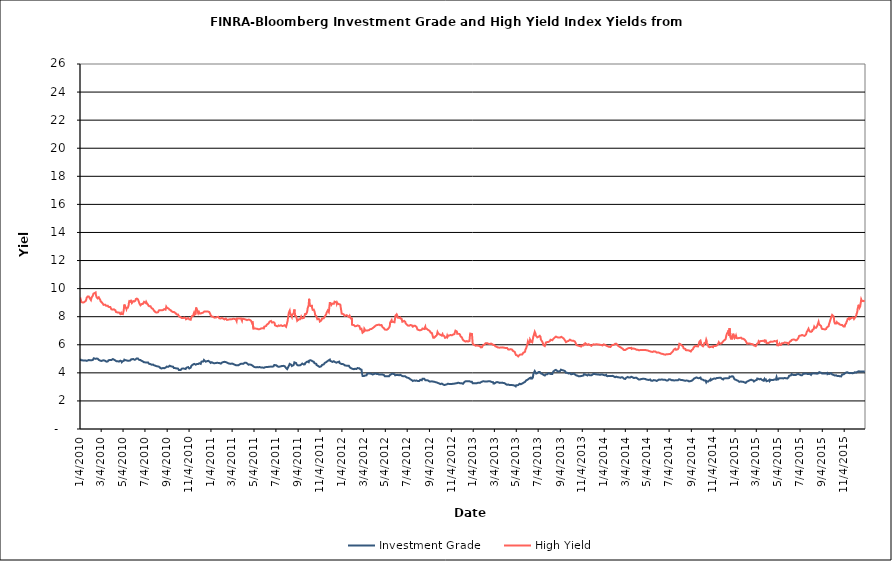
| Category | Investment Grade | High Yield |
|---|---|---|
| 1/4/10 | 4.999 | 9.369 |
| 1/5/10 | 4.915 | 9.304 |
| 1/6/10 | 4.922 | 9.169 |
| 1/7/10 | 4.901 | 9.047 |
| 1/8/10 | 4.898 | 9.058 |
| 1/11/10 | 4.889 | 9.014 |
| 1/12/10 | 4.849 | 8.983 |
| 1/13/10 | 4.867 | 8.998 |
| 1/14/10 | 4.871 | 9.02 |
| 1/15/10 | 4.832 | 9.091 |
| 1/19/10 | 4.881 | 9.112 |
| 1/20/10 | 4.852 | 9.144 |
| 1/21/10 | 4.825 | 9.212 |
| 1/22/10 | 4.854 | 9.354 |
| 1/25/10 | 4.879 | 9.444 |
| 1/26/10 | 4.876 | 9.444 |
| 1/27/10 | 4.892 | 9.447 |
| 1/28/10 | 4.912 | 9.438 |
| 1/29/10 | 4.911 | 9.441 |
| 2/1/10 | 4.898 | 9.258 |
| 2/2/10 | 4.887 | 9.234 |
| 2/3/10 | 4.905 | 9.182 |
| 2/4/10 | 4.894 | 9.243 |
| 2/5/10 | 4.893 | 9.376 |
| 2/8/10 | 4.912 | 9.483 |
| 2/9/10 | 4.939 | 9.516 |
| 2/10/10 | 4.971 | 9.639 |
| 2/11/10 | 5.039 | 9.675 |
| 2/12/10 | 4.988 | 9.653 |
| 2/16/10 | 4.997 | 9.725 |
| 2/17/10 | 4.998 | 9.538 |
| 2/18/10 | 5.011 | 9.459 |
| 2/19/10 | 5.022 | 9.382 |
| 2/22/10 | 5 | 9.304 |
| 2/23/10 | 4.958 | 9.367 |
| 2/24/10 | 4.935 | 9.339 |
| 2/25/10 | 4.92 | 9.38 |
| 2/26/10 | 4.868 | 9.358 |
| 3/1/10 | 4.871 | 9.182 |
| 3/2/10 | 4.868 | 9.1 |
| 3/3/10 | 4.852 | 9.072 |
| 3/4/10 | 4.843 | 9.086 |
| 3/5/10 | 4.878 | 9.023 |
| 3/8/10 | 4.885 | 8.941 |
| 3/9/10 | 4.872 | 8.914 |
| 3/10/10 | 4.891 | 8.842 |
| 3/11/10 | 4.893 | 8.854 |
| 3/12/10 | 4.861 | 8.844 |
| 3/15/10 | 4.852 | 8.855 |
| 3/16/10 | 4.828 | 8.822 |
| 3/17/10 | 4.8 | 8.781 |
| 3/18/10 | 4.799 | 8.748 |
| 3/19/10 | 4.808 | 8.733 |
| 3/22/10 | 4.815 | 8.778 |
| 3/23/10 | 4.809 | 8.757 |
| 3/24/10 | 4.894 | 8.699 |
| 3/25/10 | 4.937 | 8.722 |
| 3/26/10 | 4.928 | 8.701 |
| 3/29/10 | 4.919 | 8.691 |
| 3/30/10 | 4.908 | 8.658 |
| 3/31/10 | 4.877 | 8.678 |
| 4/1/10 | 4.914 | 8.523 |
| 4/5/10 | 4.983 | 8.504 |
| 4/6/10 | 4.988 | 8.531 |
| 4/7/10 | 4.95 | 8.513 |
| 4/8/10 | 4.942 | 8.525 |
| 4/9/10 | 4.93 | 8.482 |
| 4/12/10 | 4.884 | 8.459 |
| 4/13/10 | 4.857 | 8.414 |
| 4/14/10 | 4.843 | 8.332 |
| 4/15/10 | 4.829 | 8.282 |
| 4/16/10 | 4.795 | 8.274 |
| 4/19/10 | 4.827 | 8.295 |
| 4/20/10 | 4.828 | 8.274 |
| 4/21/10 | 4.8 | 8.241 |
| 4/22/10 | 4.802 | 8.303 |
| 4/23/10 | 4.852 | 8.252 |
| 4/26/10 | 4.868 | 8.194 |
| 4/27/10 | 4.82 | 8.211 |
| 4/28/10 | 4.838 | 8.267 |
| 4/29/10 | 4.826 | 8.192 |
| 4/30/10 | 4.754 | 8.225 |
| 5/3/10 | 4.831 | 8.182 |
| 5/4/10 | 4.808 | 8.233 |
| 5/5/10 | 4.814 | 8.404 |
| 5/6/10 | 4.863 | 8.601 |
| 5/7/10 | 4.939 | 8.865 |
| 5/10/10 | 4.906 | 8.687 |
| 5/11/10 | 4.915 | 8.722 |
| 5/12/10 | 4.924 | 8.609 |
| 5/13/10 | 4.885 | 8.536 |
| 5/14/10 | 4.846 | 8.618 |
| 5/17/10 | 4.86 | 8.642 |
| 5/18/10 | 4.84 | 8.689 |
| 5/19/10 | 4.848 | 8.817 |
| 5/20/10 | 4.862 | 9.024 |
| 5/21/10 | 4.898 | 9.108 |
| 5/24/10 | 4.886 | 9.066 |
| 5/25/10 | 4.956 | 9.198 |
| 5/26/10 | 4.962 | 9.128 |
| 5/27/10 | 5.008 | 9.046 |
| 5/28/10 | 4.962 | 8.975 |
| 6/1/10 | 4.985 | 9.11 |
| 6/2/10 | 5.007 | 9.12 |
| 6/3/10 | 4.998 | 9.067 |
| 6/4/10 | 4.934 | 9.086 |
| 6/7/10 | 4.943 | 9.145 |
| 6/8/10 | 4.961 | 9.251 |
| 6/9/10 | 4.962 | 9.245 |
| 6/10/10 | 5.018 | 9.225 |
| 6/11/10 | 5.016 | 9.29 |
| 6/14/10 | 5.015 | 9.235 |
| 6/15/10 | 5.01 | 9.184 |
| 6/16/10 | 4.997 | 9.102 |
| 6/17/10 | 4.929 | 9.019 |
| 6/18/10 | 4.921 | 8.943 |
| 6/21/10 | 4.912 | 8.814 |
| 6/22/10 | 4.884 | 8.838 |
| 6/23/10 | 4.85 | 8.844 |
| 6/24/10 | 4.857 | 8.898 |
| 6/25/10 | 4.859 | 8.889 |
| 6/28/10 | 4.812 | 8.913 |
| 6/29/10 | 4.792 | 8.964 |
| 6/30/10 | 4.765 | 8.929 |
| 7/1/10 | 4.749 | 9.058 |
| 7/2/10 | 4.751 | 9.06 |
| 7/6/10 | 4.744 | 8.97 |
| 7/7/10 | 4.747 | 9.049 |
| 7/8/10 | 4.738 | 8.984 |
| 7/9/10 | 4.742 | 8.945 |
| 7/12/10 | 4.745 | 8.874 |
| 7/13/10 | 4.732 | 8.787 |
| 7/14/10 | 4.726 | 8.762 |
| 7/15/10 | 4.643 | 8.764 |
| 7/16/10 | 4.608 | 8.74 |
| 7/19/10 | 4.623 | 8.743 |
| 7/20/10 | 4.602 | 8.709 |
| 7/21/10 | 4.588 | 8.733 |
| 7/22/10 | 4.579 | 8.613 |
| 7/23/10 | 4.582 | 8.602 |
| 7/26/10 | 4.589 | 8.552 |
| 7/27/10 | 4.575 | 8.506 |
| 7/28/10 | 4.574 | 8.454 |
| 7/29/10 | 4.534 | 8.491 |
| 7/30/10 | 4.477 | 8.443 |
| 8/2/10 | 4.504 | 8.321 |
| 8/3/10 | 4.467 | 8.278 |
| 8/4/10 | 4.484 | 8.304 |
| 8/5/10 | 4.473 | 8.293 |
| 8/6/10 | 4.44 | 8.299 |
| 8/9/10 | 4.454 | 8.318 |
| 8/10/10 | 4.44 | 8.314 |
| 8/11/10 | 4.421 | 8.374 |
| 8/12/10 | 4.432 | 8.464 |
| 8/13/10 | 4.416 | 8.47 |
| 8/16/10 | 4.335 | 8.467 |
| 8/17/10 | 4.344 | 8.442 |
| 8/18/10 | 4.332 | 8.461 |
| 8/19/10 | 4.31 | 8.454 |
| 8/20/10 | 4.329 | 8.479 |
| 8/23/10 | 4.349 | 8.472 |
| 8/24/10 | 4.305 | 8.515 |
| 8/25/10 | 4.309 | 8.491 |
| 8/26/10 | 4.325 | 8.543 |
| 8/27/10 | 4.393 | 8.524 |
| 8/30/10 | 4.371 | 8.5 |
| 8/31/10 | 4.342 | 8.529 |
| 9/1/10 | 4.432 | 8.714 |
| 9/2/10 | 4.446 | 8.687 |
| 9/3/10 | 4.468 | 8.632 |
| 9/7/10 | 4.432 | 8.592 |
| 9/8/10 | 4.426 | 8.613 |
| 9/9/10 | 4.476 | 8.584 |
| 9/10/10 | 4.51 | 8.5 |
| 9/13/10 | 4.474 | 8.464 |
| 9/14/10 | 4.423 | 8.499 |
| 9/15/10 | 4.426 | 8.457 |
| 9/16/10 | 4.456 | 8.38 |
| 9/17/10 | 4.449 | 8.4 |
| 9/20/10 | 4.432 | 8.328 |
| 9/21/10 | 4.401 | 8.294 |
| 9/22/10 | 4.349 | 8.309 |
| 9/23/10 | 4.339 | 8.327 |
| 9/24/10 | 4.376 | 8.318 |
| 9/27/10 | 4.332 | 8.248 |
| 9/28/10 | 4.323 | 8.271 |
| 9/29/10 | 4.314 | 8.214 |
| 9/30/10 | 4.314 | 8.164 |
| 10/1/10 | 4.294 | 8.189 |
| 10/4/10 | 4.301 | 8.149 |
| 10/5/10 | 4.278 | 8.084 |
| 10/6/10 | 4.2 | 8.041 |
| 10/7/10 | 4.192 | 8 |
| 10/8/10 | 4.171 | 7.982 |
| 10/11/10 | 4.197 | 7.961 |
| 10/12/10 | 4.208 | 7.936 |
| 10/13/10 | 4.232 | 7.914 |
| 10/14/10 | 4.294 | 7.911 |
| 10/15/10 | 4.341 | 7.938 |
| 10/18/10 | 4.312 | 7.905 |
| 10/19/10 | 4.287 | 7.938 |
| 10/20/10 | 4.287 | 7.959 |
| 10/21/10 | 4.298 | 7.945 |
| 10/22/10 | 4.301 | 7.951 |
| 10/25/10 | 4.271 | 7.898 |
| 10/26/10 | 4.326 | 7.816 |
| 10/27/10 | 4.362 | 7.843 |
| 10/28/10 | 4.348 | 7.844 |
| 10/29/10 | 4.367 | 7.853 |
| 11/1/10 | 4.41 | 7.906 |
| 11/2/10 | 4.372 | 7.909 |
| 11/3/10 | 4.352 | 7.851 |
| 11/4/10 | 4.313 | 7.812 |
| 11/5/10 | 4.348 | 7.819 |
| 11/8/10 | 4.366 | 7.782 |
| 11/9/10 | 4.411 | 7.825 |
| 11/10/10 | 4.505 | 7.954 |
| 11/11/10 | 4.497 | 7.956 |
| 11/12/10 | 4.524 | 8.056 |
| 11/15/10 | 4.605 | 8.073 |
| 11/16/10 | 4.631 | 8.181 |
| 11/17/10 | 4.596 | 8.253 |
| 11/18/10 | 4.637 | 8.124 |
| 11/19/10 | 4.608 | 8.178 |
| 11/22/10 | 4.582 | 8.201 |
| 11/23/10 | 4.557 | 8.656 |
| 11/24/10 | 4.645 | 8.606 |
| 11/26/10 | 4.636 | 8.437 |
| 11/29/10 | 4.63 | 8.235 |
| 11/30/10 | 4.615 | 8.237 |
| 12/1/10 | 4.674 | 8.34 |
| 12/2/10 | 4.685 | 8.285 |
| 12/3/10 | 4.677 | 8.227 |
| 12/6/10 | 4.64 | 8.229 |
| 12/7/10 | 4.709 | 8.208 |
| 12/8/10 | 4.799 | 8.279 |
| 12/9/10 | 4.78 | 8.261 |
| 12/10/10 | 4.795 | 8.312 |
| 12/13/10 | 4.808 | 8.292 |
| 12/14/10 | 4.858 | 8.31 |
| 12/15/10 | 4.919 | 8.361 |
| 12/16/10 | 4.915 | 8.376 |
| 12/17/10 | 4.864 | 8.387 |
| 12/20/10 | 4.795 | 8.378 |
| 12/21/10 | 4.813 | 8.392 |
| 12/22/10 | 4.8 | 8.41 |
| 12/23/10 | 4.826 | 8.364 |
| 12/27/10 | 4.857 | 8.361 |
| 12/28/10 | 4.876 | 8.299 |
| 12/29/10 | 4.839 | 8.346 |
| 12/30/10 | 4.81 | 8.33 |
| 12/31/10 | 4.776 | 8.325 |
| 1/3/11 | 4.707 | 8.102 |
| 1/4/11 | 4.687 | 8.068 |
| 1/5/11 | 4.763 | 8.023 |
| 1/6/11 | 4.756 | 8.024 |
| 1/7/11 | 4.7 | 7.997 |
| 1/10/11 | 4.699 | 7.987 |
| 1/11/11 | 4.695 | 7.979 |
| 1/12/11 | 4.706 | 7.94 |
| 1/13/11 | 4.682 | 7.933 |
| 1/14/11 | 4.658 | 7.912 |
| 1/18/11 | 4.703 | 7.948 |
| 1/19/11 | 4.671 | 7.953 |
| 1/20/11 | 4.712 | 7.966 |
| 1/21/11 | 4.718 | 7.981 |
| 1/24/11 | 4.707 | 7.988 |
| 1/25/11 | 4.673 | 7.921 |
| 1/26/11 | 4.705 | 7.926 |
| 1/27/11 | 4.696 | 7.883 |
| 1/28/11 | 4.663 | 7.93 |
| 1/31/11 | 4.66 | 7.873 |
| 2/1/11 | 4.667 | 7.931 |
| 2/2/11 | 4.688 | 7.899 |
| 2/3/11 | 4.727 | 7.911 |
| 2/4/11 | 4.77 | 7.851 |
| 2/7/11 | 4.768 | 7.858 |
| 2/8/11 | 4.779 | 7.831 |
| 2/9/11 | 4.783 | 7.823 |
| 2/10/11 | 4.785 | 7.809 |
| 2/11/11 | 4.773 | 7.839 |
| 2/14/11 | 4.764 | 7.868 |
| 2/15/11 | 4.753 | 7.851 |
| 2/16/11 | 4.745 | 7.822 |
| 2/17/11 | 4.73 | 7.77 |
| 2/18/11 | 4.739 | 7.791 |
| 2/22/11 | 4.668 | 7.795 |
| 2/23/11 | 4.665 | 7.81 |
| 2/24/11 | 4.682 | 7.83 |
| 2/25/11 | 4.655 | 7.818 |
| 2/28/11 | 4.638 | 7.808 |
| 3/1/11 | 4.589 | 7.83 |
| 3/2/11 | 4.586 | 7.834 |
| 3/3/11 | 4.664 | 7.823 |
| 3/4/11 | 4.638 | 7.821 |
| 3/7/11 | 4.629 | 7.855 |
| 3/8/11 | 4.65 | 7.805 |
| 3/9/11 | 4.614 | 7.813 |
| 3/10/11 | 4.586 | 7.838 |
| 3/11/11 | 4.543 | 7.823 |
| 3/14/11 | 4.548 | 7.811 |
| 3/15/11 | 4.542 | 7.874 |
| 3/16/11 | 4.508 | 7.69 |
| 3/17/11 | 4.538 | 7.866 |
| 3/18/11 | 4.528 | 7.809 |
| 3/21/11 | 4.536 | 7.872 |
| 3/22/11 | 4.552 | 7.838 |
| 3/23/11 | 4.57 | 7.856 |
| 3/24/11 | 4.59 | 7.865 |
| 3/25/11 | 4.62 | 7.879 |
| 3/28/11 | 4.647 | 7.882 |
| 3/29/11 | 4.677 | 7.901 |
| 3/30/11 | 4.679 | 7.889 |
| 3/31/11 | 4.641 | 7.711 |
| 4/1/11 | 4.7 | 7.847 |
| 4/4/11 | 4.648 | 7.854 |
| 4/5/11 | 4.683 | 7.823 |
| 4/6/11 | 4.708 | 7.827 |
| 4/7/11 | 4.711 | 7.823 |
| 4/8/11 | 4.712 | 7.821 |
| 4/11/11 | 4.724 | 7.795 |
| 4/12/11 | 4.686 | 7.786 |
| 4/13/11 | 4.658 | 7.811 |
| 4/14/11 | 4.675 | 7.756 |
| 4/15/11 | 4.623 | 7.772 |
| 4/18/11 | 4.582 | 7.794 |
| 4/19/11 | 4.576 | 7.741 |
| 4/20/11 | 4.584 | 7.785 |
| 4/21/11 | 4.59 | 7.782 |
| 4/25/11 | 4.582 | 7.718 |
| 4/26/11 | 4.548 | 7.699 |
| 4/27/11 | 4.587 | 7.714 |
| 4/28/11 | 4.54 | 7.566 |
| 4/29/11 | 4.516 | 7.663 |
| 5/2/11 | 4.455 | 7.147 |
| 5/3/11 | 4.438 | 7.173 |
| 5/4/11 | 4.418 | 7.156 |
| 5/5/11 | 4.409 | 7.158 |
| 5/6/11 | 4.381 | 7.124 |
| 5/9/11 | 4.396 | 7.15 |
| 5/10/11 | 4.417 | 7.107 |
| 5/11/11 | 4.414 | 7.123 |
| 5/12/11 | 4.41 | 7.139 |
| 5/13/11 | 4.401 | 7.138 |
| 5/16/11 | 4.4 | 7.101 |
| 5/17/11 | 4.361 | 7.107 |
| 5/18/11 | 4.394 | 7.121 |
| 5/19/11 | 4.411 | 7.112 |
| 5/20/11 | 4.402 | 7.124 |
| 5/23/11 | 4.383 | 7.158 |
| 5/24/11 | 4.401 | 7.152 |
| 5/25/11 | 4.403 | 7.177 |
| 5/26/11 | 4.385 | 7.173 |
| 5/27/11 | 4.38 | 7.143 |
| 5/31/11 | 4.362 | 7.166 |
| 6/1/11 | 4.344 | 7.286 |
| 6/2/11 | 4.385 | 7.311 |
| 6/3/11 | 4.4 | 7.312 |
| 6/6/11 | 4.411 | 7.332 |
| 6/7/11 | 4.412 | 7.373 |
| 6/8/11 | 4.393 | 7.424 |
| 6/9/11 | 4.408 | 7.443 |
| 6/10/11 | 4.409 | 7.449 |
| 6/13/11 | 4.428 | 7.518 |
| 6/14/11 | 4.481 | 7.547 |
| 6/15/11 | 4.453 | 7.572 |
| 6/16/11 | 4.433 | 7.65 |
| 6/17/11 | 4.436 | 7.617 |
| 6/20/11 | 4.448 | 7.694 |
| 6/21/11 | 4.448 | 7.693 |
| 6/22/11 | 4.441 | 7.662 |
| 6/23/11 | 4.436 | 7.581 |
| 6/24/11 | 4.401 | 7.57 |
| 6/27/11 | 4.464 | 7.61 |
| 6/28/11 | 4.533 | 7.562 |
| 6/29/11 | 4.56 | 7.554 |
| 6/30/11 | 4.572 | 7.548 |
| 7/1/11 | 4.575 | 7.384 |
| 7/5/11 | 4.534 | 7.342 |
| 7/6/11 | 4.512 | 7.34 |
| 7/7/11 | 4.543 | 7.321 |
| 7/8/11 | 4.46 | 7.312 |
| 7/11/11 | 4.435 | 7.38 |
| 7/12/11 | 4.423 | 7.392 |
| 7/13/11 | 4.412 | 7.35 |
| 7/14/11 | 4.442 | 7.349 |
| 7/15/11 | 4.444 | 7.365 |
| 7/18/11 | 4.469 | 7.391 |
| 7/19/11 | 4.477 | 7.395 |
| 7/20/11 | 4.455 | 7.37 |
| 7/21/11 | 4.493 | 7.342 |
| 7/22/11 | 4.456 | 7.356 |
| 7/25/11 | 4.498 | 7.349 |
| 7/26/11 | 4.489 | 7.33 |
| 7/27/11 | 4.485 | 7.366 |
| 7/28/11 | 4.473 | 7.392 |
| 7/29/11 | 4.403 | 7.402 |
| 8/1/11 | 4.339 | 7.284 |
| 8/2/11 | 4.296 | 7.374 |
| 8/3/11 | 4.278 | 7.463 |
| 8/4/11 | 4.268 | 7.586 |
| 8/5/11 | 4.337 | 7.673 |
| 8/8/11 | 4.47 | 8.204 |
| 8/9/11 | 4.498 | 8.318 |
| 8/10/11 | 4.484 | 8.332 |
| 8/11/11 | 4.637 | 8.431 |
| 8/12/11 | 4.589 | 8.274 |
| 8/15/11 | 4.581 | 8.097 |
| 8/16/11 | 4.534 | 8.082 |
| 8/17/11 | 4.488 | 7.981 |
| 8/18/11 | 4.484 | 8.141 |
| 8/19/11 | 4.517 | 8.197 |
| 8/22/11 | 4.561 | 8.236 |
| 8/23/11 | 4.649 | 8.421 |
| 8/24/11 | 4.75 | 8.512 |
| 8/25/11 | 4.714 | 8.404 |
| 8/26/11 | 4.681 | 8.072 |
| 8/29/11 | 4.694 | 8.036 |
| 8/30/11 | 4.606 | 8.007 |
| 8/31/11 | 4.58 | 7.822 |
| 9/1/11 | 4.56 | 7.707 |
| 9/2/11 | 4.535 | 7.688 |
| 9/6/11 | 4.53 | 7.822 |
| 9/7/11 | 4.537 | 7.755 |
| 9/8/11 | 4.53 | 7.77 |
| 9/9/11 | 4.539 | 7.823 |
| 9/12/11 | 4.59 | 8.004 |
| 9/13/11 | 4.632 | 7.956 |
| 9/14/11 | 4.627 | 7.884 |
| 9/15/11 | 4.663 | 7.842 |
| 9/16/11 | 4.647 | 7.838 |
| 9/19/11 | 4.601 | 7.905 |
| 9/20/11 | 4.602 | 7.867 |
| 9/21/11 | 4.585 | 7.924 |
| 9/22/11 | 4.604 | 8.111 |
| 9/23/11 | 4.687 | 8.198 |
| 9/26/11 | 4.753 | 8.2 |
| 9/27/11 | 4.796 | 8.176 |
| 9/28/11 | 4.815 | 8.306 |
| 9/29/11 | 4.804 | 8.397 |
| 9/30/11 | 4.796 | 8.597 |
| 10/3/11 | 4.758 | 8.833 |
| 10/4/11 | 4.865 | 9.274 |
| 10/5/11 | 4.896 | 9.146 |
| 10/6/11 | 4.889 | 8.849 |
| 10/7/11 | 4.896 | 8.774 |
| 10/10/11 | 4.884 | 8.759 |
| 10/11/11 | 4.92 | 8.841 |
| 10/12/11 | 4.885 | 8.668 |
| 10/13/11 | 4.832 | 8.629 |
| 10/14/11 | 4.822 | 8.488 |
| 10/17/11 | 4.787 | 8.501 |
| 10/18/11 | 4.743 | 8.518 |
| 10/19/11 | 4.691 | 8.381 |
| 10/20/11 | 4.662 | 8.288 |
| 10/21/11 | 4.653 | 8.132 |
| 10/24/11 | 4.64 | 8.041 |
| 10/25/11 | 4.55 | 7.993 |
| 10/26/11 | 4.534 | 8.05 |
| 10/27/11 | 4.537 | 7.819 |
| 10/28/11 | 4.514 | 7.833 |
| 10/31/11 | 4.455 | 7.86 |
| 11/1/11 | 4.471 | 7.807 |
| 11/2/11 | 4.431 | 7.758 |
| 11/3/11 | 4.424 | 7.657 |
| 11/4/11 | 4.48 | 7.703 |
| 11/7/11 | 4.473 | 7.73 |
| 11/8/11 | 4.523 | 7.682 |
| 11/9/11 | 4.559 | 7.869 |
| 11/10/11 | 4.597 | 7.838 |
| 11/11/11 | 4.583 | 7.822 |
| 11/14/11 | 4.608 | 7.885 |
| 11/15/11 | 4.667 | 7.952 |
| 11/16/11 | 4.662 | 7.983 |
| 11/17/11 | 4.714 | 8.039 |
| 11/18/11 | 4.723 | 8.06 |
| 11/21/11 | 4.761 | 8.201 |
| 11/22/11 | 4.803 | 8.293 |
| 11/23/11 | 4.825 | 8.322 |
| 11/25/11 | 4.849 | 8.445 |
| 11/28/11 | 4.9 | 8.329 |
| 11/29/11 | 4.907 | 8.382 |
| 11/30/11 | 4.903 | 8.311 |
| 12/1/11 | 4.944 | 9.038 |
| 12/2/11 | 4.849 | 8.95 |
| 12/5/11 | 4.824 | 8.837 |
| 12/6/11 | 4.808 | 8.852 |
| 12/7/11 | 4.815 | 8.935 |
| 12/8/11 | 4.775 | 8.944 |
| 12/9/11 | 4.824 | 8.964 |
| 12/12/11 | 4.826 | 8.918 |
| 12/13/11 | 4.814 | 8.961 |
| 12/14/11 | 4.796 | 9.072 |
| 12/15/11 | 4.771 | 9.036 |
| 12/16/11 | 4.726 | 9.006 |
| 12/19/11 | 4.72 | 9.022 |
| 12/20/11 | 4.752 | 8.926 |
| 12/21/11 | 4.762 | 9.013 |
| 12/22/11 | 4.758 | 8.997 |
| 12/23/11 | 4.785 | 8.923 |
| 12/27/11 | 4.798 | 8.891 |
| 12/28/11 | 4.696 | 8.936 |
| 12/29/11 | 4.681 | 8.906 |
| 12/30/11 | 4.631 | 8.86 |
| 1/3/12 | 4.624 | 8.216 |
| 1/4/12 | 4.644 | 8.259 |
| 1/5/12 | 4.644 | 8.232 |
| 1/6/12 | 4.626 | 8.199 |
| 1/9/12 | 4.59 | 8.152 |
| 1/10/12 | 4.585 | 8.087 |
| 1/11/12 | 4.55 | 8.061 |
| 1/12/12 | 4.527 | 8.108 |
| 1/13/12 | 4.51 | 8.124 |
| 1/17/12 | 4.51 | 8.108 |
| 1/18/12 | 4.485 | 8.052 |
| 1/19/12 | 4.488 | 8.052 |
| 1/20/12 | 4.503 | 8.047 |
| 1/23/12 | 4.499 | 7.982 |
| 1/24/12 | 4.515 | 7.979 |
| 1/25/12 | 4.463 | 8.067 |
| 1/26/12 | 4.377 | 8.005 |
| 1/27/12 | 4.344 | 7.944 |
| 1/30/12 | 4.318 | 7.856 |
| 1/31/12 | 4.288 | 7.93 |
| 2/1/12 | 4.311 | 7.42 |
| 2/2/12 | 4.283 | 7.458 |
| 2/3/12 | 4.302 | 7.45 |
| 2/6/12 | 4.261 | 7.402 |
| 2/7/12 | 4.294 | 7.41 |
| 2/8/12 | 4.264 | 7.338 |
| 2/9/12 | 4.292 | 7.322 |
| 2/10/12 | 4.28 | 7.37 |
| 2/13/12 | 4.27 | 7.333 |
| 2/14/12 | 4.268 | 7.355 |
| 2/15/12 | 4.272 | 7.348 |
| 2/16/12 | 4.34 | 7.377 |
| 2/17/12 | 4.318 | 7.315 |
| 2/21/12 | 4.326 | 7.333 |
| 2/22/12 | 4.307 | 7.259 |
| 2/23/12 | 4.289 | 7.23 |
| 2/24/12 | 4.256 | 7.113 |
| 2/27/12 | 4.227 | 7.141 |
| 2/28/12 | 4.205 | 7.128 |
| 2/29/12 | 4.196 | 7.087 |
| 3/1/12 | 3.782 | 6.859 |
| 3/2/12 | 3.739 | 6.877 |
| 3/5/12 | 3.776 | 6.946 |
| 3/6/12 | 3.792 | 7.137 |
| 3/7/12 | 3.798 | 7.084 |
| 3/8/12 | 3.816 | 7.085 |
| 3/9/12 | 3.829 | 7.01 |
| 3/12/12 | 3.82 | 7.02 |
| 3/13/12 | 3.866 | 7.002 |
| 3/14/12 | 3.94 | 6.987 |
| 3/15/12 | 3.944 | 7.022 |
| 3/16/12 | 3.939 | 7.01 |
| 3/19/12 | 3.961 | 7.042 |
| 3/20/12 | 3.981 | 7.089 |
| 3/21/12 | 3.94 | 7.051 |
| 3/22/12 | 3.95 | 7.109 |
| 3/23/12 | 3.919 | 7.133 |
| 3/26/12 | 3.924 | 7.127 |
| 3/27/12 | 3.874 | 7.107 |
| 3/28/12 | 3.883 | 7.113 |
| 3/29/12 | 3.883 | 7.181 |
| 3/30/12 | 3.888 | 7.142 |
| 4/2/12 | 3.914 | 7.257 |
| 4/3/12 | 3.93 | 7.25 |
| 4/4/12 | 3.973 | 7.286 |
| 4/5/12 | 3.958 | 7.331 |
| 4/9/12 | 3.923 | 7.398 |
| 4/10/12 | 3.915 | 7.462 |
| 4/11/12 | 3.932 | 7.466 |
| 4/12/12 | 3.927 | 7.411 |
| 4/13/12 | 3.896 | 7.375 |
| 4/16/12 | 3.885 | 7.44 |
| 4/17/12 | 3.895 | 7.391 |
| 4/18/12 | 3.887 | 7.378 |
| 4/19/12 | 3.875 | 7.389 |
| 4/20/12 | 3.891 | 7.374 |
| 4/23/12 | 3.88 | 7.407 |
| 4/24/12 | 3.89 | 7.354 |
| 4/25/12 | 3.902 | 7.283 |
| 4/26/12 | 3.877 | 7.261 |
| 4/27/12 | 3.859 | 7.23 |
| 4/30/12 | 3.838 | 7.166 |
| 5/1/12 | 3.79 | 7.111 |
| 5/2/12 | 3.763 | 7.089 |
| 5/3/12 | 3.753 | 7.084 |
| 5/4/12 | 3.741 | 7.073 |
| 5/7/12 | 3.754 | 7.065 |
| 5/8/12 | 3.736 | 7.096 |
| 5/9/12 | 3.758 | 7.133 |
| 5/10/12 | 3.764 | 7.106 |
| 5/11/12 | 3.753 | 7.114 |
| 5/14/12 | 3.761 | 7.218 |
| 5/15/12 | 3.777 | 7.243 |
| 5/16/12 | 3.834 | 7.333 |
| 5/17/12 | 3.87 | 7.578 |
| 5/18/12 | 3.902 | 7.646 |
| 5/21/12 | 3.917 | 7.752 |
| 5/22/12 | 3.933 | 7.622 |
| 5/23/12 | 3.918 | 7.682 |
| 5/24/12 | 3.937 | 7.672 |
| 5/25/12 | 3.915 | 7.64 |
| 5/29/12 | 3.905 | 7.602 |
| 5/30/12 | 3.862 | 7.632 |
| 5/31/12 | 3.826 | 7.662 |
| 6/1/12 | 3.818 | 8.092 |
| 6/4/12 | 3.85 | 8.17 |
| 6/5/12 | 3.878 | 8.21 |
| 6/6/12 | 3.886 | 8.066 |
| 6/7/12 | 3.856 | 7.931 |
| 6/8/12 | 3.836 | 7.933 |
| 6/11/12 | 3.828 | 7.914 |
| 6/12/12 | 3.856 | 7.949 |
| 6/13/12 | 3.86 | 7.943 |
| 6/14/12 | 3.863 | 7.942 |
| 6/15/12 | 3.821 | 7.87 |
| 6/18/12 | 3.8 | 7.848 |
| 6/19/12 | 3.803 | 7.732 |
| 6/20/12 | 3.792 | 7.639 |
| 6/21/12 | 3.763 | 7.625 |
| 6/22/12 | 3.773 | 7.65 |
| 6/25/12 | 3.762 | 7.701 |
| 6/26/12 | 3.776 | 7.674 |
| 6/27/12 | 3.768 | 7.646 |
| 6/28/12 | 3.751 | 7.632 |
| 6/29/12 | 3.757 | 7.535 |
| 7/2/12 | 3.673 | 7.447 |
| 7/3/12 | 3.66 | 7.406 |
| 7/5/12 | 3.651 | 7.378 |
| 7/6/12 | 3.629 | 7.342 |
| 7/9/12 | 3.611 | 7.357 |
| 7/10/12 | 3.588 | 7.354 |
| 7/11/12 | 3.572 | 7.34 |
| 7/12/12 | 3.541 | 7.402 |
| 7/13/12 | 3.535 | 7.388 |
| 7/16/12 | 3.487 | 7.396 |
| 7/17/12 | 3.48 | 7.399 |
| 7/18/12 | 3.431 | 7.363 |
| 7/19/12 | 3.418 | 7.288 |
| 7/20/12 | 3.447 | 7.314 |
| 7/23/12 | 3.462 | 7.359 |
| 7/24/12 | 3.448 | 7.378 |
| 7/25/12 | 3.445 | 7.399 |
| 7/26/12 | 3.44 | 7.346 |
| 7/27/12 | 3.483 | 7.292 |
| 7/30/12 | 3.45 | 7.246 |
| 7/31/12 | 3.416 | 7.184 |
| 8/1/12 | 3.428 | 7.092 |
| 8/2/12 | 3.414 | 7.106 |
| 8/3/12 | 3.45 | 7.088 |
| 8/6/12 | 3.418 | 7.041 |
| 8/7/12 | 3.461 | 7.003 |
| 8/8/12 | 3.479 | 7.034 |
| 8/9/12 | 3.504 | 7.035 |
| 8/10/12 | 3.473 | 7.07 |
| 8/13/12 | 3.471 | 7.073 |
| 8/14/12 | 3.518 | 7.074 |
| 8/15/12 | 3.575 | 7.155 |
| 8/16/12 | 3.592 | 7.161 |
| 8/17/12 | 3.585 | 7.148 |
| 8/20/12 | 3.578 | 7.123 |
| 8/21/12 | 3.57 | 7.089 |
| 8/22/12 | 3.519 | 7.077 |
| 8/23/12 | 3.479 | 7.292 |
| 8/24/12 | 3.488 | 7.141 |
| 8/27/12 | 3.472 | 7.141 |
| 8/28/12 | 3.462 | 7.084 |
| 8/29/12 | 3.479 | 7.101 |
| 8/30/12 | 3.462 | 7.07 |
| 8/31/12 | 3.429 | 7.058 |
| 9/4/12 | 3.381 | 6.991 |
| 9/5/12 | 3.393 | 6.999 |
| 9/6/12 | 3.42 | 6.945 |
| 9/7/12 | 3.379 | 6.864 |
| 9/10/12 | 3.397 | 6.85 |
| 9/11/12 | 3.389 | 6.773 |
| 9/12/12 | 3.394 | 6.683 |
| 9/13/12 | 3.38 | 6.624 |
| 9/14/12 | 3.386 | 6.506 |
| 9/17/12 | 3.365 | 6.507 |
| 9/18/12 | 3.349 | 6.545 |
| 9/19/12 | 3.325 | 6.538 |
| 9/20/12 | 3.34 | 6.588 |
| 9/21/12 | 3.334 | 6.594 |
| 9/24/12 | 3.314 | 6.685 |
| 9/25/12 | 3.315 | 6.734 |
| 9/26/12 | 3.304 | 6.91 |
| 9/27/12 | 3.28 | 6.846 |
| 9/28/12 | 3.261 | 6.81 |
| 10/1/12 | 3.242 | 6.745 |
| 10/2/12 | 3.225 | 6.758 |
| 10/3/12 | 3.206 | 6.729 |
| 10/4/12 | 3.198 | 6.708 |
| 10/5/12 | 3.217 | 6.665 |
| 10/8/12 | 3.234 | 6.651 |
| 10/9/12 | 3.211 | 6.699 |
| 10/10/12 | 3.215 | 6.75 |
| 10/11/12 | 3.18 | 6.673 |
| 10/12/12 | 3.137 | 6.659 |
| 10/15/12 | 3.135 | 6.614 |
| 10/16/12 | 3.134 | 6.56 |
| 10/17/12 | 3.131 | 6.493 |
| 10/18/12 | 3.149 | 6.482 |
| 10/19/12 | 3.16 | 6.522 |
| 10/22/12 | 3.183 | 6.536 |
| 10/23/12 | 3.201 | 6.636 |
| 10/24/12 | 3.205 | 6.564 |
| 10/25/12 | 3.228 | 6.597 |
| 10/26/12 | 3.2 | 6.662 |
| 10/29/12 | 3.203 | 6.656 |
| 10/30/12 | 3.206 | 6.657 |
| 10/31/12 | 3.18 | 6.676 |
| 11/1/12 | 3.205 | 6.697 |
| 11/2/12 | 3.215 | 6.665 |
| 11/5/12 | 3.207 | 6.673 |
| 11/6/12 | 3.241 | 6.638 |
| 11/7/12 | 3.226 | 6.716 |
| 11/8/12 | 3.223 | 6.722 |
| 11/9/12 | 3.226 | 6.772 |
| 11/12/12 | 3.231 | 6.76 |
| 11/13/12 | 3.234 | 6.859 |
| 11/14/12 | 3.234 | 6.896 |
| 11/15/12 | 3.248 | 7.004 |
| 11/16/12 | 3.256 | 7.034 |
| 11/19/12 | 3.264 | 6.942 |
| 11/20/12 | 3.279 | 6.776 |
| 11/21/12 | 3.306 | 6.812 |
| 11/23/12 | 3.3 | 6.777 |
| 11/26/12 | 3.276 | 6.775 |
| 11/27/12 | 3.269 | 6.718 |
| 11/28/12 | 3.258 | 6.697 |
| 11/29/12 | 3.25 | 6.607 |
| 11/30/12 | 3.244 | 6.561 |
| 12/3/12 | 3.252 | 6.521 |
| 12/4/12 | 3.247 | 6.486 |
| 12/5/12 | 3.223 | 6.392 |
| 12/6/12 | 3.219 | 6.372 |
| 12/7/12 | 3.243 | 6.317 |
| 12/10/12 | 3.35 | 6.272 |
| 12/11/12 | 3.362 | 6.245 |
| 12/12/12 | 3.371 | 6.232 |
| 12/13/12 | 3.396 | 6.227 |
| 12/14/12 | 3.383 | 6.224 |
| 12/17/12 | 3.403 | 6.265 |
| 12/18/12 | 3.431 | 6.248 |
| 12/19/12 | 3.404 | 6.208 |
| 12/20/12 | 3.399 | 6.227 |
| 12/21/12 | 3.382 | 6.275 |
| 12/24/12 | 3.403 | 6.269 |
| 12/26/12 | 3.377 | 6.796 |
| 12/27/12 | 3.36 | 6.778 |
| 12/28/12 | 3.343 | 6.772 |
| 12/31/12 | 3.362 | 6.769 |
| 1/2/13 | 3.253 | 6.097 |
| 1/3/13 | 3.262 | 6.031 |
| 1/4/13 | 3.275 | 6.009 |
| 1/7/13 | 3.263 | 5.989 |
| 1/8/13 | 3.254 | 5.982 |
| 1/9/13 | 3.254 | 5.981 |
| 1/10/13 | 3.263 | 5.936 |
| 1/11/13 | 3.269 | 5.922 |
| 1/14/13 | 3.266 | 5.942 |
| 1/15/13 | 3.27 | 5.969 |
| 1/16/13 | 3.27 | 5.969 |
| 1/17/13 | 3.3 | 5.937 |
| 1/18/13 | 3.291 | 5.899 |
| 1/22/13 | 3.284 | 5.903 |
| 1/23/13 | 3.277 | 5.86 |
| 1/24/13 | 3.294 | 5.846 |
| 1/25/13 | 3.332 | 5.809 |
| 1/28/13 | 3.372 | 5.827 |
| 1/29/13 | 3.379 | 5.889 |
| 1/30/13 | 3.401 | 5.942 |
| 1/31/13 | 3.394 | 6.003 |
| 2/1/13 | 3.393 | 5.96 |
| 2/4/13 | 3.392 | 6.024 |
| 2/5/13 | 3.412 | 6.065 |
| 2/6/13 | 3.397 | 6.086 |
| 2/7/13 | 3.382 | 6.107 |
| 2/8/13 | 3.395 | 6.111 |
| 2/11/13 | 3.385 | 6.118 |
| 2/12/13 | 3.399 | 6.096 |
| 2/13/13 | 3.412 | 6.09 |
| 2/14/13 | 3.398 | 6.075 |
| 2/15/13 | 3.402 | 6.08 |
| 2/19/13 | 3.405 | 6.055 |
| 2/20/13 | 3.406 | 6.039 |
| 2/21/13 | 3.382 | 6.101 |
| 2/22/13 | 3.373 | 6.085 |
| 2/25/13 | 3.342 | 6.054 |
| 2/26/13 | 3.328 | 6.07 |
| 2/27/13 | 3.332 | 6.052 |
| 2/28/13 | 3.335 | 5.988 |
| 3/1/13 | 3.239 | 5.98 |
| 3/4/13 | 3.242 | 5.966 |
| 3/5/13 | 3.255 | 5.902 |
| 3/6/13 | 3.279 | 5.894 |
| 3/7/13 | 3.308 | 5.863 |
| 3/8/13 | 3.345 | 5.861 |
| 3/11/13 | 3.345 | 5.841 |
| 3/12/13 | 3.32 | 5.826 |
| 3/13/13 | 3.327 | 5.822 |
| 3/14/13 | 3.328 | 5.799 |
| 3/15/13 | 3.305 | 5.794 |
| 3/18/13 | 3.284 | 5.795 |
| 3/19/13 | 3.26 | 5.788 |
| 3/20/13 | 3.291 | 5.81 |
| 3/21/13 | 3.296 | 5.805 |
| 3/22/13 | 3.302 | 5.8 |
| 3/25/13 | 3.303 | 5.814 |
| 3/26/13 | 3.312 | 5.815 |
| 3/27/13 | 3.283 | 5.806 |
| 3/28/13 | 3.28 | 5.806 |
| 4/1/13 | 3.264 | 5.782 |
| 4/2/13 | 3.274 | 5.776 |
| 4/3/13 | 3.242 | 5.781 |
| 4/4/13 | 3.202 | 5.769 |
| 4/5/13 | 3.149 | 5.775 |
| 4/8/13 | 3.151 | 5.769 |
| 4/9/13 | 3.146 | 5.733 |
| 4/10/13 | 3.17 | 5.712 |
| 4/11/13 | 3.172 | 5.667 |
| 4/12/13 | 3.142 | 5.651 |
| 4/15/13 | 3.128 | 5.669 |
| 4/16/13 | 3.134 | 5.653 |
| 4/17/13 | 3.128 | 5.675 |
| 4/18/13 | 3.127 | 5.689 |
| 4/19/13 | 3.135 | 5.67 |
| 4/22/13 | 3.126 | 5.653 |
| 4/23/13 | 3.117 | 5.6 |
| 4/24/13 | 3.105 | 5.569 |
| 4/25/13 | 3.125 | 5.572 |
| 4/26/13 | 3.092 | 5.534 |
| 4/29/13 | 3.087 | 5.499 |
| 4/30/13 | 3.086 | 5.43 |
| 5/1/13 | 3.067 | 5.368 |
| 5/2/13 | 3.036 | 5.305 |
| 5/3/13 | 3.109 | 5.266 |
| 5/6/13 | 3.117 | 5.244 |
| 5/7/13 | 3.136 | 5.201 |
| 5/8/13 | 3.129 | 5.184 |
| 5/9/13 | 3.131 | 5.173 |
| 5/10/13 | 3.19 | 5.221 |
| 5/13/13 | 3.224 | 5.288 |
| 5/14/13 | 3.228 | 5.326 |
| 5/15/13 | 3.223 | 5.334 |
| 5/16/13 | 3.19 | 5.306 |
| 5/17/13 | 3.218 | 5.305 |
| 5/20/13 | 3.234 | 5.306 |
| 5/21/13 | 3.229 | 5.314 |
| 5/22/13 | 3.258 | 5.327 |
| 5/23/13 | 3.284 | 5.429 |
| 5/24/13 | 3.284 | 5.465 |
| 5/28/13 | 3.36 | 5.504 |
| 5/29/13 | 3.404 | 5.657 |
| 5/30/13 | 3.413 | 5.675 |
| 5/31/13 | 3.463 | 5.748 |
| 6/3/13 | 3.494 | 5.995 |
| 6/4/13 | 3.522 | 6.063 |
| 6/5/13 | 3.552 | 6.239 |
| 6/6/13 | 3.551 | 6.291 |
| 6/7/13 | 3.57 | 6.113 |
| 6/10/13 | 3.628 | 6.164 |
| 6/11/13 | 3.681 | 6.371 |
| 6/12/13 | 3.674 | 6.305 |
| 6/13/13 | 3.66 | 6.359 |
| 6/14/13 | 3.588 | 6.227 |
| 6/17/13 | 3.599 | 6.175 |
| 6/18/13 | 3.646 | 6.192 |
| 6/19/13 | 3.69 | 6.237 |
| 6/20/13 | 3.91 | 6.572 |
| 6/21/13 | 3.967 | 6.634 |
| 6/24/13 | 4.127 | 6.924 |
| 6/25/13 | 4.1 | 6.906 |
| 6/26/13 | 4.034 | 6.807 |
| 6/27/13 | 3.965 | 6.661 |
| 6/28/13 | 3.948 | 6.621 |
| 7/1/13 | 3.98 | 6.527 |
| 7/2/13 | 3.946 | 6.515 |
| 7/3/13 | 3.938 | 6.511 |
| 7/5/13 | 4.063 | 6.58 |
| 7/8/13 | 4.062 | 6.64 |
| 7/9/13 | 4.028 | 6.597 |
| 7/10/13 | 4.031 | 6.565 |
| 7/11/13 | 3.96 | 6.376 |
| 7/12/13 | 3.939 | 6.31 |
| 7/15/13 | 3.925 | 6.216 |
| 7/16/13 | 3.898 | 6.158 |
| 7/17/13 | 3.86 | 6.1 |
| 7/18/13 | 3.855 | 5.979 |
| 7/19/13 | 3.825 | 5.96 |
| 7/22/13 | 3.811 | 5.908 |
| 7/23/13 | 3.816 | 5.902 |
| 7/24/13 | 3.884 | 6.035 |
| 7/25/13 | 3.915 | 6.163 |
| 7/26/13 | 3.885 | 6.171 |
| 7/29/13 | 3.902 | 6.194 |
| 7/30/13 | 3.908 | 6.189 |
| 7/31/13 | 3.941 | 6.239 |
| 8/1/13 | 3.969 | 6.199 |
| 8/2/13 | 3.925 | 6.226 |
| 8/5/13 | 3.944 | 6.265 |
| 8/6/13 | 3.953 | 6.313 |
| 8/7/13 | 3.934 | 6.358 |
| 8/8/13 | 3.913 | 6.344 |
| 8/9/13 | 3.916 | 6.347 |
| 8/12/13 | 3.923 | 6.324 |
| 8/13/13 | 4.006 | 6.362 |
| 8/14/13 | 4.018 | 6.359 |
| 8/15/13 | 4.099 | 6.426 |
| 8/16/13 | 4.129 | 6.46 |
| 8/19/13 | 4.18 | 6.522 |
| 8/20/13 | 4.155 | 6.544 |
| 8/21/13 | 4.183 | 6.569 |
| 8/22/13 | 4.211 | 6.583 |
| 8/23/13 | 4.166 | 6.552 |
| 8/26/13 | 4.123 | 6.531 |
| 8/27/13 | 4.082 | 6.547 |
| 8/28/13 | 4.096 | 6.551 |
| 8/29/13 | 4.092 | 6.517 |
| 8/30/13 | 4.071 | 6.478 |
| 9/3/13 | 4.136 | 6.523 |
| 9/4/13 | 4.142 | 6.53 |
| 9/5/13 | 4.228 | 6.578 |
| 9/6/13 | 4.2 | 6.565 |
| 9/9/13 | 4.187 | 6.515 |
| 9/10/13 | 4.229 | 6.522 |
| 9/11/13 | 4.208 | 6.505 |
| 9/12/13 | 4.17 | 6.461 |
| 9/13/13 | 4.184 | 6.455 |
| 9/16/13 | 4.128 | 6.326 |
| 9/17/13 | 4.134 | 6.364 |
| 9/18/13 | 4.104 | 6.315 |
| 9/19/13 | 4.011 | 6.189 |
| 9/20/13 | 4.008 | 6.188 |
| 9/23/13 | 3.998 | 6.249 |
| 9/24/13 | 3.96 | 6.231 |
| 9/25/13 | 3.94 | 6.257 |
| 9/26/13 | 3.957 | 6.271 |
| 9/27/13 | 3.951 | 6.297 |
| 9/30/13 | 3.97 | 6.364 |
| 10/1/13 | 3.942 | 6.375 |
| 10/2/13 | 3.916 | 6.359 |
| 10/3/13 | 3.897 | 6.31 |
| 10/4/13 | 3.925 | 6.295 |
| 10/7/13 | 3.916 | 6.288 |
| 10/8/13 | 3.924 | 6.308 |
| 10/9/13 | 3.938 | 6.326 |
| 10/10/13 | 3.948 | 6.286 |
| 10/11/13 | 3.91 | 6.244 |
| 10/14/13 | 3.897 | 6.226 |
| 10/15/13 | 3.933 | 6.22 |
| 10/16/13 | 3.91 | 6.161 |
| 10/17/13 | 3.823 | 6.063 |
| 10/18/13 | 3.753 | 5.992 |
| 10/21/13 | 3.801 | 5.954 |
| 10/22/13 | 3.751 | 5.916 |
| 10/23/13 | 3.738 | 5.926 |
| 10/24/13 | 3.757 | 5.93 |
| 10/25/13 | 3.752 | 5.918 |
| 10/28/13 | 3.76 | 5.906 |
| 10/29/13 | 3.759 | 5.89 |
| 10/30/13 | 3.742 | 5.891 |
| 10/31/13 | 3.771 | 5.876 |
| 11/1/13 | 3.795 | 5.951 |
| 11/4/13 | 3.796 | 5.939 |
| 11/5/13 | 3.844 | 5.976 |
| 11/6/13 | 3.827 | 5.962 |
| 11/7/13 | 3.813 | 5.955 |
| 11/8/13 | 3.899 | 6.033 |
| 11/11/13 | 3.894 | 6.024 |
| 11/12/13 | 3.936 | 6.103 |
| 11/13/13 | 3.906 | 6.126 |
| 11/14/13 | 3.856 | 6.076 |
| 11/15/13 | 3.848 | 6.045 |
| 11/18/13 | 3.809 | 5.992 |
| 11/19/13 | 3.825 | 6.008 |
| 11/20/13 | 3.853 | 6.015 |
| 11/21/13 | 3.879 | 6.04 |
| 11/22/13 | 3.847 | 5.999 |
| 11/25/13 | 3.821 | 5.98 |
| 11/26/13 | 3.799 | 5.977 |
| 11/27/13 | 3.816 | 5.936 |
| 11/29/13 | 3.822 | 5.927 |
| 12/2/13 | 3.881 | 5.994 |
| 12/3/13 | 3.869 | 5.992 |
| 12/4/13 | 3.91 | 6.015 |
| 12/5/13 | 3.928 | 6.031 |
| 12/6/13 | 3.927 | 6.016 |
| 12/9/13 | 3.91 | 6.018 |
| 12/10/13 | 3.87 | 5.984 |
| 12/11/13 | 3.872 | 5.997 |
| 12/12/13 | 3.9 | 6.039 |
| 12/13/13 | 3.895 | 6.03 |
| 12/16/13 | 3.878 | 6.026 |
| 12/17/13 | 3.858 | 6.027 |
| 12/18/13 | 3.859 | 6.033 |
| 12/19/13 | 3.878 | 6.024 |
| 12/20/13 | 3.856 | 6.016 |
| 12/23/13 | 3.857 | 5.993 |
| 12/24/13 | 3.875 | 5.996 |
| 12/26/13 | 3.89 | 5.991 |
| 12/27/13 | 3.903 | 5.977 |
| 12/30/13 | 3.883 | 5.95 |
| 12/31/13 | 3.873 | 5.948 |
| 1/2/14 | 3.844 | 6.025 |
| 1/3/14 | 3.842 | 6.009 |
| 1/6/14 | 3.825 | 5.995 |
| 1/7/14 | 3.818 | 5.951 |
| 1/8/14 | 3.87 | 5.943 |
| 1/9/14 | 3.864 | 5.942 |
| 1/10/14 | 3.79 | 5.914 |
| 1/13/14 | 3.762 | 5.905 |
| 1/14/14 | 3.784 | 5.909 |
| 1/15/14 | 3.803 | 5.867 |
| 1/16/14 | 3.78 | 5.861 |
| 1/17/14 | 3.766 | 5.831 |
| 1/21/14 | 3.774 | 5.843 |
| 1/22/14 | 3.801 | 5.829 |
| 1/23/14 | 3.784 | 5.857 |
| 1/24/14 | 3.772 | 5.948 |
| 1/27/14 | 3.786 | 5.982 |
| 1/28/14 | 3.782 | 5.991 |
| 1/29/14 | 3.754 | 6.003 |
| 1/30/14 | 3.748 | 5.991 |
| 1/31/14 | 3.738 | 6.016 |
| 2/3/14 | 3.69 | 6.066 |
| 2/4/14 | 3.699 | 6.082 |
| 2/5/14 | 3.722 | 6.098 |
| 2/6/14 | 3.728 | 6.079 |
| 2/7/14 | 3.695 | 6.015 |
| 2/10/14 | 3.691 | 5.986 |
| 2/11/14 | 3.713 | 5.962 |
| 2/12/14 | 3.724 | 5.911 |
| 2/13/14 | 3.68 | 5.9 |
| 2/14/14 | 3.672 | 5.865 |
| 2/18/14 | 3.652 | 5.821 |
| 2/19/14 | 3.651 | 5.805 |
| 2/20/14 | 3.695 | 5.797 |
| 2/21/14 | 3.681 | 5.767 |
| 2/24/14 | 3.677 | 5.721 |
| 2/25/14 | 3.637 | 5.673 |
| 2/26/14 | 3.618 | 5.653 |
| 2/27/14 | 3.595 | 5.636 |
| 2/28/14 | 3.598 | 5.604 |
| 3/3/14 | 3.563 | 5.628 |
| 3/4/14 | 3.601 | 5.616 |
| 3/5/14 | 3.613 | 5.618 |
| 3/6/14 | 3.649 | 5.671 |
| 3/7/14 | 3.701 | 5.709 |
| 3/10/14 | 3.709 | 5.736 |
| 3/11/14 | 3.709 | 5.734 |
| 3/12/14 | 3.691 | 5.747 |
| 3/13/14 | 3.664 | 5.765 |
| 3/14/14 | 3.655 | 5.799 |
| 3/17/14 | 3.663 | 5.765 |
| 3/18/14 | 3.661 | 5.749 |
| 3/19/14 | 3.675 | 5.728 |
| 3/20/14 | 3.72 | 5.777 |
| 3/21/14 | 3.695 | 5.705 |
| 3/24/14 | 3.678 | 5.735 |
| 3/25/14 | 3.669 | 5.735 |
| 3/26/14 | 3.626 | 5.694 |
| 3/27/14 | 3.629 | 5.724 |
| 3/28/14 | 3.647 | 5.698 |
| 3/31/14 | 3.652 | 5.7 |
| 4/1/14 | 3.641 | 5.714 |
| 4/2/14 | 3.676 | 5.658 |
| 4/3/14 | 3.658 | 5.653 |
| 4/4/14 | 3.612 | 5.634 |
| 4/7/14 | 3.582 | 5.65 |
| 4/8/14 | 3.577 | 5.642 |
| 4/9/14 | 3.572 | 5.618 |
| 4/10/14 | 3.527 | 5.604 |
| 4/11/14 | 3.519 | 5.647 |
| 4/14/14 | 3.533 | 5.622 |
| 4/15/14 | 3.529 | 5.639 |
| 4/16/14 | 3.534 | 5.633 |
| 4/17/14 | 3.562 | 5.633 |
| 4/21/14 | 3.574 | 5.631 |
| 4/22/14 | 3.588 | 5.628 |
| 4/23/14 | 3.564 | 5.628 |
| 4/24/14 | 3.572 | 5.628 |
| 4/25/14 | 3.554 | 5.625 |
| 4/28/14 | 3.568 | 5.63 |
| 4/29/14 | 3.582 | 5.617 |
| 4/30/14 | 3.551 | 5.598 |
| 5/1/14 | 3.522 | 5.612 |
| 5/2/14 | 3.506 | 5.584 |
| 5/5/14 | 3.507 | 5.594 |
| 5/6/14 | 3.51 | 5.583 |
| 5/7/14 | 3.506 | 5.579 |
| 5/8/14 | 3.493 | 5.562 |
| 5/9/14 | 3.498 | 5.534 |
| 5/12/14 | 3.526 | 5.525 |
| 5/13/14 | 3.501 | 5.514 |
| 5/14/14 | 3.446 | 5.488 |
| 5/15/14 | 3.426 | 5.499 |
| 5/16/14 | 3.439 | 5.512 |
| 5/19/14 | 3.443 | 5.491 |
| 5/20/14 | 3.448 | 5.508 |
| 5/21/14 | 3.47 | 5.5 |
| 5/22/14 | 3.482 | 5.53 |
| 5/23/14 | 3.463 | 5.526 |
| 5/27/14 | 3.462 | 5.512 |
| 5/28/14 | 3.401 | 5.487 |
| 5/29/14 | 3.398 | 5.479 |
| 5/30/14 | 3.421 | 5.443 |
| 6/2/14 | 3.475 | 5.453 |
| 6/3/14 | 3.517 | 5.48 |
| 6/4/14 | 3.528 | 5.481 |
| 6/5/14 | 3.519 | 5.441 |
| 6/6/14 | 3.499 | 5.411 |
| 6/9/14 | 3.513 | 5.394 |
| 6/10/14 | 3.532 | 5.381 |
| 6/11/14 | 3.523 | 5.359 |
| 6/12/14 | 3.523 | 5.362 |
| 6/13/14 | 3.519 | 5.366 |
| 6/16/14 | 3.516 | 5.346 |
| 6/17/14 | 3.546 | 5.364 |
| 6/18/14 | 3.533 | 5.363 |
| 6/19/14 | 3.511 | 5.314 |
| 6/20/14 | 3.523 | 5.304 |
| 6/23/14 | 3.501 | 5.294 |
| 6/24/14 | 3.494 | 5.293 |
| 6/25/14 | 3.465 | 5.304 |
| 6/26/14 | 3.453 | 5.321 |
| 6/27/14 | 3.457 | 5.324 |
| 6/30/14 | 3.458 | 5.329 |
| 7/1/14 | 3.475 | 5.317 |
| 7/2/14 | 3.514 | 5.332 |
| 7/3/14 | 3.538 | 5.336 |
| 7/7/14 | 3.53 | 5.343 |
| 7/8/14 | 3.473 | 5.364 |
| 7/9/14 | 3.502 | 5.384 |
| 7/10/14 | 3.481 | 5.427 |
| 7/11/14 | 3.466 | 5.431 |
| 7/14/14 | 3.482 | 5.531 |
| 7/15/14 | 3.497 | 5.553 |
| 7/16/14 | 3.49 | 5.582 |
| 7/17/14 | 3.459 | 5.665 |
| 7/18/14 | 3.469 | 5.704 |
| 7/21/14 | 3.467 | 5.719 |
| 7/22/14 | 3.458 | 5.682 |
| 7/23/14 | 3.443 | 5.641 |
| 7/24/14 | 3.478 | 5.654 |
| 7/25/14 | 3.446 | 5.658 |
| 7/28/14 | 3.469 | 5.688 |
| 7/29/14 | 3.455 | 5.7 |
| 7/30/14 | 3.506 | 5.764 |
| 7/31/14 | 3.543 | 5.968 |
| 8/1/14 | 3.525 | 6.073 |
| 8/4/14 | 3.505 | 6.045 |
| 8/5/14 | 3.517 | 5.981 |
| 8/6/14 | 3.51 | 5.994 |
| 8/7/14 | 3.485 | 5.965 |
| 8/8/14 | 3.464 | 5.953 |
| 8/11/14 | 3.48 | 5.889 |
| 8/12/14 | 3.494 | 5.843 |
| 8/13/14 | 3.476 | 5.746 |
| 8/14/14 | 3.454 | 5.721 |
| 8/15/14 | 3.415 | 5.695 |
| 8/18/14 | 3.436 | 5.699 |
| 8/19/14 | 3.443 | 5.618 |
| 8/20/14 | 3.467 | 5.635 |
| 8/21/14 | 3.456 | 5.605 |
| 8/22/14 | 3.449 | 5.612 |
| 8/25/14 | 3.437 | 5.607 |
| 8/26/14 | 3.427 | 5.585 |
| 8/27/14 | 3.422 | 5.589 |
| 8/28/14 | 3.39 | 5.591 |
| 8/29/14 | 3.388 | 5.58 |
| 9/2/14 | 3.417 | 5.521 |
| 9/3/14 | 3.422 | 5.55 |
| 9/4/14 | 3.455 | 5.611 |
| 9/5/14 | 3.442 | 5.659 |
| 9/8/14 | 3.508 | 5.69 |
| 9/9/14 | 3.502 | 5.725 |
| 9/10/14 | 3.526 | 5.811 |
| 9/11/14 | 3.592 | 5.863 |
| 9/12/14 | 3.644 | 5.879 |
| 9/15/14 | 3.645 | 5.918 |
| 9/16/14 | 3.638 | 5.941 |
| 9/17/14 | 3.642 | 5.916 |
| 9/18/14 | 3.672 | 5.895 |
| 9/19/14 | 3.648 | 5.863 |
| 9/22/14 | 3.624 | 5.882 |
| 9/23/14 | 3.611 | 5.959 |
| 9/24/14 | 3.634 | 6.004 |
| 9/25/14 | 3.622 | 6.133 |
| 9/26/14 | 3.675 | 6.226 |
| 9/29/14 | 3.665 | 6.297 |
| 9/30/14 | 3.666 | 6.198 |
| 10/1/14 | 3.546 | 6.041 |
| 10/2/14 | 3.543 | 6.033 |
| 10/3/14 | 3.562 | 5.951 |
| 10/6/14 | 3.511 | 5.891 |
| 10/7/14 | 3.49 | 5.942 |
| 10/8/14 | 3.476 | 5.966 |
| 10/9/14 | 3.455 | 6.047 |
| 10/10/14 | 3.455 | 6.125 |
| 10/13/14 | 3.455 | 6.126 |
| 10/14/14 | 3.415 | 6.254 |
| 10/15/14 | 3.322 | 6.366 |
| 10/16/14 | 3.392 | 6.295 |
| 10/17/14 | 3.405 | 6.024 |
| 10/20/14 | 3.378 | 6.011 |
| 10/21/14 | 3.408 | 5.869 |
| 10/22/14 | 3.423 | 5.856 |
| 10/23/14 | 3.438 | 5.833 |
| 10/24/14 | 3.46 | 5.826 |
| 10/27/14 | 3.549 | 5.844 |
| 10/28/14 | 3.47 | 5.831 |
| 10/29/14 | 3.508 | 5.854 |
| 10/30/14 | 3.484 | 5.863 |
| 10/31/14 | 3.523 | 5.818 |
| 11/3/14 | 3.563 | 5.828 |
| 11/4/14 | 3.561 | 5.914 |
| 11/5/14 | 3.58 | 5.896 |
| 11/6/14 | 3.597 | 5.904 |
| 11/7/14 | 3.571 | 5.919 |
| 11/10/14 | 3.581 | 5.911 |
| 11/11/14 | 3.58 | 5.894 |
| 11/12/14 | 3.61 | 5.917 |
| 11/13/14 | 3.63 | 5.944 |
| 11/14/14 | 3.622 | 5.986 |
| 11/17/14 | 3.639 | 6.05 |
| 11/18/14 | 3.664 | 6.114 |
| 11/19/14 | 3.676 | 6.183 |
| 11/20/14 | 3.645 | 6.193 |
| 11/21/14 | 3.61 | 6.102 |
| 11/24/14 | 3.655 | 6.077 |
| 11/25/14 | 3.614 | 6.062 |
| 11/26/14 | 3.592 | 6.055 |
| 11/28/14 | 3.571 | 6.136 |
| 12/1/14 | 3.527 | 6.244 |
| 12/2/14 | 3.592 | 6.31 |
| 12/3/14 | 3.6 | 6.3 |
| 12/4/14 | 3.583 | 6.311 |
| 12/5/14 | 3.624 | 6.33 |
| 12/8/14 | 3.613 | 6.401 |
| 12/9/14 | 3.596 | 6.533 |
| 12/10/14 | 3.594 | 6.652 |
| 12/11/14 | 3.607 | 6.697 |
| 12/12/14 | 3.574 | 6.816 |
| 12/15/14 | 3.61 | 6.93 |
| 12/16/14 | 3.622 | 7.031 |
| 12/17/14 | 3.611 | 6.874 |
| 12/18/14 | 3.64 | 6.631 |
| 12/19/14 | 3.733 | 7.172 |
| 12/22/14 | 3.718 | 6.524 |
| 12/23/14 | 3.739 | 6.429 |
| 12/24/14 | 3.766 | 6.426 |
| 12/26/14 | 3.758 | 6.424 |
| 12/29/14 | 3.733 | 6.787 |
| 12/30/14 | 3.701 | 6.803 |
| 12/31/14 | 3.703 | 6.802 |
| 1/2/15 | 3.539 | 6.473 |
| 1/5/15 | 3.512 | 6.579 |
| 1/6/15 | 3.46 | 6.653 |
| 1/7/15 | 3.461 | 6.584 |
| 1/8/15 | 3.475 | 6.473 |
| 1/9/15 | 3.446 | 6.454 |
| 1/12/15 | 3.428 | 6.47 |
| 1/13/15 | 3.418 | 6.483 |
| 1/14/15 | 3.39 | 6.514 |
| 1/15/15 | 3.36 | 6.485 |
| 1/16/15 | 3.398 | 6.499 |
| 1/20/15 | 3.388 | 6.507 |
| 1/21/15 | 3.406 | 6.501 |
| 1/22/15 | 3.418 | 6.465 |
| 1/23/15 | 3.358 | 6.428 |
| 1/26/15 | 3.361 | 6.434 |
| 1/27/15 | 3.345 | 6.403 |
| 1/28/15 | 3.321 | 6.38 |
| 1/29/15 | 3.327 | 6.384 |
| 1/30/15 | 3.263 | 6.383 |
| 2/2/15 | 3.283 | 6.276 |
| 2/3/15 | 3.33 | 6.218 |
| 2/4/15 | 3.356 | 6.175 |
| 2/5/15 | 3.339 | 6.128 |
| 2/6/15 | 3.407 | 6.077 |
| 2/9/15 | 3.421 | 6.086 |
| 2/10/15 | 3.462 | 6.091 |
| 2/11/15 | 3.47 | 6.106 |
| 2/12/15 | 3.453 | 6.094 |
| 2/13/15 | 3.458 | 6.04 |
| 2/17/15 | 3.516 | 6.061 |
| 2/18/15 | 3.496 | 6.032 |
| 2/19/15 | 3.481 | 6.045 |
| 2/20/15 | 3.471 | 6.044 |
| 2/23/15 | 3.46 | 6.021 |
| 2/24/15 | 3.413 | 5.985 |
| 2/25/15 | 3.385 | 5.95 |
| 2/26/15 | 3.409 | 5.923 |
| 2/27/15 | 3.418 | 5.91 |
| 3/2/15 | 3.477 | 5.903 |
| 3/3/15 | 3.496 | 5.943 |
| 3/4/15 | 3.51 | 5.991 |
| 3/5/15 | 3.501 | 6 |
| 3/6/15 | 3.594 | 6.079 |
| 3/9/15 | 3.577 | 6.134 |
| 3/10/15 | 3.55 | 6.235 |
| 3/11/15 | 3.562 | 6.188 |
| 3/12/15 | 3.536 | 6.163 |
| 3/13/15 | 3.575 | 6.241 |
| 3/16/15 | 3.572 | 6.268 |
| 3/17/15 | 3.575 | 6.335 |
| 3/18/15 | 3.525 | 6.323 |
| 3/19/15 | 3.502 | 6.265 |
| 3/20/15 | 3.473 | 6.273 |
| 3/23/15 | 3.447 | 6.285 |
| 3/24/15 | 3.422 | 6.276 |
| 3/25/15 | 3.437 | 6.217 |
| 3/26/15 | 3.564 | 6.235 |
| 3/27/15 | 3.474 | 6.318 |
| 3/30/15 | 3.526 | 6.299 |
| 3/31/15 | 3.507 | 6.274 |
| 4/1/15 | 3.404 | 6.124 |
| 4/2/15 | 3.449 | 6.142 |
| 4/6/15 | 3.44 | 6.113 |
| 4/7/15 | 3.404 | 6.048 |
| 4/8/15 | 3.398 | 6.153 |
| 4/9/15 | 3.501 | 6.166 |
| 4/10/15 | 3.417 | 6.184 |
| 4/13/15 | 3.504 | 6.228 |
| 4/14/15 | 3.471 | 6.226 |
| 4/15/15 | 3.473 | 6.219 |
| 4/16/15 | 3.484 | 6.218 |
| 4/17/15 | 3.473 | 6.234 |
| 4/20/15 | 3.489 | 6.228 |
| 4/21/15 | 3.492 | 6.234 |
| 4/22/15 | 3.533 | 6.256 |
| 4/23/15 | 3.533 | 6.264 |
| 4/24/15 | 3.564 | 6.251 |
| 4/27/15 | 3.515 | 6.246 |
| 4/28/15 | 3.552 | 6.264 |
| 4/29/15 | 3.699 | 6.302 |
| 4/30/15 | 3.726 | 6.285 |
| 5/1/15 | 3.52 | 5.968 |
| 5/4/15 | 3.534 | 5.958 |
| 5/5/15 | 3.574 | 5.972 |
| 5/6/15 | 3.62 | 6.006 |
| 5/7/15 | 3.605 | 6.081 |
| 5/8/15 | 3.55 | 5.995 |
| 5/11/15 | 3.609 | 5.99 |
| 5/12/15 | 3.65 | 6.054 |
| 5/13/15 | 3.637 | 6.048 |
| 5/14/15 | 3.622 | 6.108 |
| 5/15/15 | 3.557 | 6.102 |
| 5/18/15 | 3.6 | 6.112 |
| 5/19/15 | 3.651 | 6.136 |
| 5/20/15 | 3.661 | 6.167 |
| 5/21/15 | 3.638 | 6.158 |
| 5/22/15 | 3.64 | 6.136 |
| 5/26/15 | 3.609 | 6.149 |
| 5/27/15 | 3.605 | 6.158 |
| 5/28/15 | 3.609 | 6.154 |
| 5/29/15 | 3.603 | 6.129 |
| 6/1/15 | 3.671 | 6.055 |
| 6/2/15 | 3.74 | 6.084 |
| 6/3/15 | 3.79 | 6.139 |
| 6/4/15 | 3.77 | 6.173 |
| 6/5/15 | 3.818 | 6.229 |
| 6/8/15 | 3.819 | 6.264 |
| 6/9/15 | 3.86 | 6.317 |
| 6/10/15 | 3.91 | 6.341 |
| 6/11/15 | 3.87 | 6.29 |
| 6/12/15 | 3.84 | 6.32 |
| 6/15/15 | 3.842 | 6.375 |
| 6/16/15 | 3.839 | 6.396 |
| 6/17/15 | 3.856 | 6.39 |
| 6/18/15 | 3.846 | 6.365 |
| 6/19/15 | 3.809 | 6.333 |
| 6/22/15 | 3.854 | 6.31 |
| 6/23/15 | 3.886 | 6.314 |
| 6/24/15 | 3.89 | 6.335 |
| 6/25/15 | 3.906 | 6.351 |
| 6/26/15 | 3.933 | 6.383 |
| 6/29/15 | 3.911 | 6.493 |
| 6/30/15 | 3.862 | 6.48 |
| 7/1/15 | 3.903 | 6.633 |
| 7/2/15 | 3.879 | 6.623 |
| 7/6/15 | 3.834 | 6.661 |
| 7/7/15 | 3.788 | 6.691 |
| 7/8/15 | 3.79 | 6.722 |
| 7/9/15 | 3.833 | 6.699 |
| 7/10/15 | 3.898 | 6.684 |
| 7/13/15 | 3.945 | 6.654 |
| 7/14/15 | 3.962 | 6.658 |
| 7/15/15 | 3.941 | 6.639 |
| 7/16/15 | 3.928 | 6.631 |
| 7/17/15 | 3.92 | 6.684 |
| 7/20/15 | 3.957 | 6.728 |
| 7/21/15 | 3.946 | 6.789 |
| 7/22/15 | 3.931 | 6.902 |
| 7/23/15 | 3.927 | 6.942 |
| 7/24/15 | 3.914 | 6.987 |
| 7/27/15 | 3.912 | 7.142 |
| 7/28/15 | 3.92 | 7.122 |
| 7/29/15 | 3.945 | 7.014 |
| 7/30/15 | 3.937 | 6.955 |
| 7/31/15 | 3.891 | 6.938 |
| 8/3/15 | 3.859 | 6.92 |
| 8/4/15 | 3.885 | 6.888 |
| 8/5/15 | 3.946 | 6.932 |
| 8/6/15 | 3.943 | 6.967 |
| 8/7/15 | 3.927 | 7.062 |
| 8/10/15 | 3.964 | 7.093 |
| 8/11/15 | 3.914 | 7.18 |
| 8/12/15 | 3.922 | 7.288 |
| 8/13/15 | 3.961 | 7.23 |
| 8/14/15 | 3.966 | 7.205 |
| 8/17/15 | 3.946 | 7.205 |
| 8/18/15 | 3.964 | 7.21 |
| 8/19/15 | 3.97 | 7.268 |
| 8/20/15 | 3.942 | 7.329 |
| 8/21/15 | 3.932 | 7.397 |
| 8/24/15 | 3.969 | 7.631 |
| 8/25/15 | 4.004 | 7.506 |
| 8/26/15 | 4.048 | 7.509 |
| 8/27/15 | 4.024 | 7.42 |
| 8/28/15 | 3.999 | 7.369 |
| 8/31/15 | 4.006 | 7.34 |
| 9/1/15 | 3.984 | 7.221 |
| 9/2/15 | 3.974 | 7.211 |
| 9/3/15 | 3.949 | 7.128 |
| 9/4/15 | 3.918 | 7.154 |
| 9/8/15 | 3.947 | 7.11 |
| 9/9/15 | 3.956 | 7.075 |
| 9/10/15 | 3.97 | 7.101 |
| 9/11/15 | 3.954 | 7.087 |
| 9/14/15 | 3.96 | 7.121 |
| 9/15/15 | 4.007 | 7.156 |
| 9/16/15 | 4.028 | 7.23 |
| 9/17/15 | 3.993 | 7.256 |
| 9/18/15 | 3.906 | 7.296 |
| 9/21/15 | 3.934 | 7.32 |
| 9/22/15 | 3.908 | 7.44 |
| 9/23/15 | 3.928 | 7.47 |
| 9/24/15 | 3.924 | 7.602 |
| 9/25/15 | 3.968 | 7.65 |
| 9/28/15 | 3.972 | 7.936 |
| 9/29/15 | 3.972 | 8.01 |
| 9/30/15 | 3.965 | 7.959 |
| 10/1/15 | 3.884 | 8.129 |
| 10/2/15 | 3.839 | 8.158 |
| 10/5/15 | 3.857 | 8.024 |
| 10/6/15 | 3.84 | 7.851 |
| 10/7/15 | 3.818 | 7.629 |
| 10/8/15 | 3.812 | 7.659 |
| 10/9/15 | 3.837 | 7.508 |
| 10/12/15 | 3.824 | 7.508 |
| 10/13/15 | 3.812 | 7.563 |
| 10/14/15 | 3.768 | 7.61 |
| 10/15/15 | 3.779 | 7.616 |
| 10/16/15 | 3.788 | 7.538 |
| 10/19/15 | 3.785 | 7.528 |
| 10/20/15 | 3.814 | 7.497 |
| 10/21/15 | 3.788 | 7.455 |
| 10/22/15 | 3.753 | 7.473 |
| 10/23/15 | 3.796 | 7.388 |
| 10/26/15 | 3.747 | 7.413 |
| 10/27/15 | 3.743 | 7.438 |
| 10/28/15 | 3.777 | 7.418 |
| 10/29/15 | 3.886 | 7.404 |
| 10/30/15 | 3.896 | 7.394 |
| 11/2/15 | 3.894 | 7.301 |
| 11/3/15 | 3.935 | 7.298 |
| 11/4/15 | 3.959 | 7.279 |
| 11/5/15 | 3.956 | 7.305 |
| 11/6/15 | 3.965 | 7.419 |
| 11/9/15 | 4.026 | 7.539 |
| 11/10/15 | 4.023 | 7.622 |
| 11/11/15 | 3.98 | 7.598 |
| 11/12/15 | 4.043 | 7.738 |
| 11/13/15 | 4.012 | 7.843 |
| 11/16/15 | 3.995 | 7.878 |
| 11/17/15 | 4.004 | 7.77 |
| 11/18/15 | 4.007 | 7.96 |
| 11/19/15 | 3.976 | 7.826 |
| 11/20/15 | 3.983 | 7.817 |
| 11/23/15 | 3.992 | 7.892 |
| 11/24/15 | 3.987 | 7.94 |
| 11/25/15 | 3.985 | 7.947 |
| 11/27/15 | 3.969 | 7.941 |
| 11/30/15 | 3.988 | 7.921 |
| 12/1/15 | 3.922 | 7.843 |
| 12/2/15 | 3.941 | 7.803 |
| 12/3/15 | 4.042 | 7.88 |
| 12/4/15 | 4.027 | 7.946 |
| 12/7/15 | 4.02 | 8.079 |
| 12/8/15 | 4.022 | 8.196 |
| 12/9/15 | 4.049 | 8.261 |
| 12/10/15 | 4.07 | 8.336 |
| 12/11/15 | 4.029 | 8.573 |
| 12/14/15 | 4.113 | 8.851 |
| 12/15/15 | 4.144 | 8.708 |
| 12/16/15 | 4.149 | 8.625 |
| 12/17/15 | 4.1 | 8.603 |
| 12/18/15 | 4.089 | 8.721 |
| 12/21/15 | 4.094 | 9.233 |
| 12/22/15 | 4.106 | 9.187 |
| 12/23/15 | 4.112 | 9.11 |
| 12/24/15 | 4.101 | 9.094 |
| 12/28/15 | 4.087 | 9.127 |
| 12/29/15 | 4.12 | 9.054 |
| 12/30/15 | 4.125 | 9.036 |
| 12/31/15 | 4.104 | 9.06 |